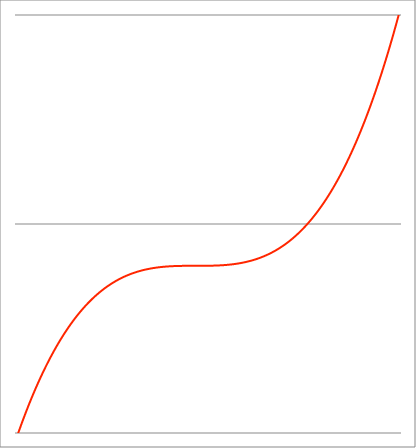
| Category | Series 1 |
|---|---|
| -0.94 | -1.031 |
| -0.93899 | -1.028 |
| -0.93798 | -1.025 |
| -0.93697 | -1.023 |
| -0.93596 | -1.02 |
| -0.93495 | -1.017 |
| -0.93394 | -1.015 |
| -0.93293 | -1.012 |
| -0.93192 | -1.009 |
| -0.93091 | -1.007 |
| -0.9299 | -1.004 |
| -0.92889 | -1.001 |
| -0.92788 | -0.999 |
| -0.92687 | -0.996 |
| -0.925860000000001 | -0.994 |
| -0.924850000000001 | -0.991 |
| -0.923840000000001 | -0.988 |
| -0.922830000000001 | -0.986 |
| -0.921820000000001 | -0.983 |
| -0.920810000000001 | -0.981 |
| -0.919800000000001 | -0.978 |
| -0.918790000000001 | -0.976 |
| -0.917780000000001 | -0.973 |
| -0.916770000000001 | -0.971 |
| -0.915760000000001 | -0.968 |
| -0.914750000000001 | -0.965 |
| -0.913740000000001 | -0.963 |
| -0.912730000000001 | -0.96 |
| -0.911720000000001 | -0.958 |
| -0.910710000000001 | -0.955 |
| -0.909700000000001 | -0.953 |
| -0.908690000000001 | -0.95 |
| -0.907680000000001 | -0.948 |
| -0.906670000000001 | -0.945 |
| -0.905660000000001 | -0.943 |
| -0.904650000000001 | -0.94 |
| -0.903640000000002 | -0.938 |
| -0.902630000000002 | -0.935 |
| -0.901620000000002 | -0.933 |
| -0.900610000000002 | -0.93 |
| -0.899600000000002 | -0.928 |
| -0.898590000000002 | -0.926 |
| -0.897580000000002 | -0.923 |
| -0.896570000000002 | -0.921 |
| -0.895560000000002 | -0.918 |
| -0.894550000000002 | -0.916 |
| -0.893540000000002 | -0.913 |
| -0.892530000000002 | -0.911 |
| -0.891520000000002 | -0.909 |
| -0.890510000000002 | -0.906 |
| -0.889500000000002 | -0.904 |
| -0.888490000000002 | -0.901 |
| -0.887480000000002 | -0.899 |
| -0.886470000000002 | -0.897 |
| -0.885460000000002 | -0.894 |
| -0.884450000000002 | -0.892 |
| -0.883440000000002 | -0.889 |
| -0.882430000000002 | -0.887 |
| -0.881420000000002 | -0.885 |
| -0.880410000000003 | -0.882 |
| -0.879400000000003 | -0.88 |
| -0.878390000000003 | -0.878 |
| -0.877380000000003 | -0.875 |
| -0.876370000000003 | -0.873 |
| -0.875360000000003 | -0.871 |
| -0.874350000000003 | -0.868 |
| -0.873340000000003 | -0.866 |
| -0.872330000000003 | -0.864 |
| -0.871320000000003 | -0.862 |
| -0.870310000000003 | -0.859 |
| -0.869300000000003 | -0.857 |
| -0.868290000000003 | -0.855 |
| -0.867280000000003 | -0.852 |
| -0.866270000000003 | -0.85 |
| -0.865260000000003 | -0.848 |
| -0.864250000000003 | -0.846 |
| -0.863240000000003 | -0.843 |
| -0.862230000000003 | -0.841 |
| -0.861220000000003 | -0.839 |
| -0.860210000000003 | -0.837 |
| -0.859200000000003 | -0.834 |
| -0.858190000000004 | -0.832 |
| -0.857180000000004 | -0.83 |
| -0.856170000000004 | -0.828 |
| -0.855160000000004 | -0.825 |
| -0.854150000000004 | -0.823 |
| -0.853140000000004 | -0.821 |
| -0.852130000000004 | -0.819 |
| -0.851120000000004 | -0.817 |
| -0.850110000000004 | -0.814 |
| -0.849100000000004 | -0.812 |
| -0.848090000000004 | -0.81 |
| -0.847080000000004 | -0.808 |
| -0.846070000000004 | -0.806 |
| -0.845060000000004 | -0.803 |
| -0.844050000000004 | -0.801 |
| -0.843040000000004 | -0.799 |
| -0.842030000000004 | -0.797 |
| -0.841020000000004 | -0.795 |
| -0.840010000000004 | -0.793 |
| -0.839000000000004 | -0.791 |
| -0.837990000000004 | -0.788 |
| -0.836980000000004 | -0.786 |
| -0.835970000000004 | -0.784 |
| -0.834960000000005 | -0.782 |
| -0.833950000000005 | -0.78 |
| -0.832940000000005 | -0.778 |
| -0.831930000000005 | -0.776 |
| -0.830920000000005 | -0.774 |
| -0.829910000000005 | -0.772 |
| -0.828900000000005 | -0.77 |
| -0.827890000000005 | -0.767 |
| -0.826880000000005 | -0.765 |
| -0.825870000000005 | -0.763 |
| -0.824860000000005 | -0.761 |
| -0.823850000000005 | -0.759 |
| -0.822840000000005 | -0.757 |
| -0.821830000000005 | -0.755 |
| -0.820820000000005 | -0.753 |
| -0.819810000000005 | -0.751 |
| -0.818800000000005 | -0.749 |
| -0.817790000000005 | -0.747 |
| -0.816780000000005 | -0.745 |
| -0.815770000000005 | -0.743 |
| -0.814760000000005 | -0.741 |
| -0.813750000000005 | -0.739 |
| -0.812740000000006 | -0.737 |
| -0.811730000000006 | -0.735 |
| -0.810720000000006 | -0.733 |
| -0.809710000000006 | -0.731 |
| -0.808700000000006 | -0.729 |
| -0.807690000000006 | -0.727 |
| -0.806680000000006 | -0.725 |
| -0.805670000000006 | -0.723 |
| -0.804660000000006 | -0.721 |
| -0.803650000000006 | -0.719 |
| -0.802640000000006 | -0.717 |
| -0.801630000000006 | -0.715 |
| -0.800620000000006 | -0.713 |
| -0.799610000000006 | -0.711 |
| -0.798600000000006 | -0.709 |
| -0.797590000000006 | -0.707 |
| -0.796580000000006 | -0.705 |
| -0.795570000000006 | -0.704 |
| -0.794560000000006 | -0.702 |
| -0.793550000000006 | -0.7 |
| -0.792540000000006 | -0.698 |
| -0.791530000000006 | -0.696 |
| -0.790520000000006 | -0.694 |
| -0.789510000000007 | -0.692 |
| -0.788500000000007 | -0.69 |
| -0.787490000000007 | -0.688 |
| -0.786480000000007 | -0.686 |
| -0.785470000000007 | -0.685 |
| -0.784460000000007 | -0.683 |
| -0.783450000000007 | -0.681 |
| -0.782440000000007 | -0.679 |
| -0.781430000000007 | -0.677 |
| -0.780420000000007 | -0.675 |
| -0.779410000000007 | -0.673 |
| -0.778400000000007 | -0.672 |
| -0.777390000000007 | -0.67 |
| -0.776380000000007 | -0.668 |
| -0.775370000000007 | -0.666 |
| -0.774360000000007 | -0.664 |
| -0.773350000000007 | -0.663 |
| -0.772340000000007 | -0.661 |
| -0.771330000000007 | -0.659 |
| -0.770320000000007 | -0.657 |
| -0.769310000000007 | -0.655 |
| -0.768300000000007 | -0.654 |
| -0.767290000000007 | -0.652 |
| -0.766280000000008 | -0.65 |
| -0.765270000000008 | -0.648 |
| -0.764260000000008 | -0.646 |
| -0.763250000000008 | -0.645 |
| -0.762240000000008 | -0.643 |
| -0.761230000000008 | -0.641 |
| -0.760220000000008 | -0.639 |
| -0.759210000000008 | -0.638 |
| -0.758200000000008 | -0.636 |
| -0.757190000000008 | -0.634 |
| -0.756180000000008 | -0.632 |
| -0.755170000000008 | -0.631 |
| -0.754160000000008 | -0.629 |
| -0.753150000000008 | -0.627 |
| -0.752140000000008 | -0.625 |
| -0.751130000000008 | -0.624 |
| -0.750120000000008 | -0.622 |
| -0.749110000000008 | -0.62 |
| -0.748100000000008 | -0.619 |
| -0.747090000000008 | -0.617 |
| -0.746080000000008 | -0.615 |
| -0.745070000000008 | -0.614 |
| -0.744060000000009 | -0.612 |
| -0.743050000000009 | -0.61 |
| -0.742040000000009 | -0.609 |
| -0.741030000000009 | -0.607 |
| -0.740020000000009 | -0.605 |
| -0.739010000000009 | -0.604 |
| -0.738000000000009 | -0.602 |
| -0.736990000000009 | -0.6 |
| -0.735980000000009 | -0.599 |
| -0.734970000000009 | -0.597 |
| -0.733960000000009 | -0.595 |
| -0.732950000000009 | -0.594 |
| -0.731940000000009 | -0.592 |
| -0.730930000000009 | -0.591 |
| -0.729920000000009 | -0.589 |
| -0.728910000000009 | -0.587 |
| -0.727900000000009 | -0.586 |
| -0.726890000000009 | -0.584 |
| -0.725880000000009 | -0.582 |
| -0.724870000000009 | -0.581 |
| -0.723860000000009 | -0.579 |
| -0.722850000000009 | -0.578 |
| -0.72184000000001 | -0.576 |
| -0.72083000000001 | -0.575 |
| -0.71982000000001 | -0.573 |
| -0.71881000000001 | -0.571 |
| -0.71780000000001 | -0.57 |
| -0.71679000000001 | -0.568 |
| -0.71578000000001 | -0.567 |
| -0.71477000000001 | -0.565 |
| -0.71376000000001 | -0.564 |
| -0.71275000000001 | -0.562 |
| -0.71174000000001 | -0.561 |
| -0.71073000000001 | -0.559 |
| -0.70972000000001 | -0.557 |
| -0.70871000000001 | -0.556 |
| -0.70770000000001 | -0.554 |
| -0.70669000000001 | -0.553 |
| -0.70568000000001 | -0.551 |
| -0.70467000000001 | -0.55 |
| -0.70366000000001 | -0.548 |
| -0.70265000000001 | -0.547 |
| -0.70164000000001 | -0.545 |
| -0.70063000000001 | -0.544 |
| -0.69962000000001 | -0.542 |
| -0.69861000000001 | -0.541 |
| -0.697600000000011 | -0.539 |
| -0.696590000000011 | -0.538 |
| -0.695580000000011 | -0.537 |
| -0.694570000000011 | -0.535 |
| -0.693560000000011 | -0.534 |
| -0.692550000000011 | -0.532 |
| -0.691540000000011 | -0.531 |
| -0.690530000000011 | -0.529 |
| -0.689520000000011 | -0.528 |
| -0.688510000000011 | -0.526 |
| -0.687500000000011 | -0.525 |
| -0.686490000000011 | -0.524 |
| -0.685480000000011 | -0.522 |
| -0.684470000000011 | -0.521 |
| -0.683460000000011 | -0.519 |
| -0.682450000000011 | -0.518 |
| -0.681440000000011 | -0.516 |
| -0.680430000000011 | -0.515 |
| -0.679420000000011 | -0.514 |
| -0.678410000000011 | -0.512 |
| -0.677400000000011 | -0.511 |
| -0.676390000000011 | -0.509 |
| -0.675380000000012 | -0.508 |
| -0.674370000000012 | -0.507 |
| -0.673360000000012 | -0.505 |
| -0.672350000000012 | -0.504 |
| -0.671340000000012 | -0.503 |
| -0.670330000000012 | -0.501 |
| -0.669320000000012 | -0.5 |
| -0.668310000000012 | -0.498 |
| -0.667300000000012 | -0.497 |
| -0.666290000000012 | -0.496 |
| -0.665280000000012 | -0.494 |
| -0.664270000000012 | -0.493 |
| -0.663260000000012 | -0.492 |
| -0.662250000000012 | -0.49 |
| -0.661240000000012 | -0.489 |
| -0.660230000000012 | -0.488 |
| -0.659220000000012 | -0.486 |
| -0.658210000000012 | -0.485 |
| -0.657200000000012 | -0.484 |
| -0.656190000000012 | -0.483 |
| -0.655180000000012 | -0.481 |
| -0.654170000000012 | -0.48 |
| -0.653160000000013 | -0.479 |
| -0.652150000000013 | -0.477 |
| -0.651140000000013 | -0.476 |
| -0.650130000000013 | -0.475 |
| -0.649120000000013 | -0.474 |
| -0.648110000000013 | -0.472 |
| -0.647100000000013 | -0.471 |
| -0.646090000000013 | -0.47 |
| -0.645080000000013 | -0.468 |
| -0.644070000000013 | -0.467 |
| -0.643060000000013 | -0.466 |
| -0.642050000000013 | -0.465 |
| -0.641040000000013 | -0.463 |
| -0.640030000000013 | -0.462 |
| -0.639020000000013 | -0.461 |
| -0.638010000000013 | -0.46 |
| -0.637000000000013 | -0.458 |
| -0.635990000000013 | -0.457 |
| -0.634980000000013 | -0.456 |
| -0.633970000000013 | -0.455 |
| -0.632960000000013 | -0.454 |
| -0.631950000000013 | -0.452 |
| -0.630940000000014 | -0.451 |
| -0.629930000000014 | -0.45 |
| -0.628920000000014 | -0.449 |
| -0.627910000000014 | -0.448 |
| -0.626900000000014 | -0.446 |
| -0.625890000000014 | -0.445 |
| -0.624880000000014 | -0.444 |
| -0.623870000000014 | -0.443 |
| -0.622860000000014 | -0.442 |
| -0.621850000000014 | -0.44 |
| -0.620840000000014 | -0.439 |
| -0.619830000000014 | -0.438 |
| -0.618820000000014 | -0.437 |
| -0.617810000000014 | -0.436 |
| -0.616800000000014 | -0.435 |
| -0.615790000000014 | -0.434 |
| -0.614780000000014 | -0.432 |
| -0.613770000000014 | -0.431 |
| -0.612760000000014 | -0.43 |
| -0.611750000000014 | -0.429 |
| -0.610740000000014 | -0.428 |
| -0.609730000000014 | -0.427 |
| -0.608720000000014 | -0.426 |
| -0.607710000000015 | -0.424 |
| -0.606700000000015 | -0.423 |
| -0.605690000000015 | -0.422 |
| -0.604680000000015 | -0.421 |
| -0.603670000000015 | -0.42 |
| -0.602660000000015 | -0.419 |
| -0.601650000000015 | -0.418 |
| -0.600640000000015 | -0.417 |
| -0.599630000000015 | -0.416 |
| -0.598620000000015 | -0.415 |
| -0.597610000000015 | -0.413 |
| -0.596600000000015 | -0.412 |
| -0.595590000000015 | -0.411 |
| -0.594580000000015 | -0.41 |
| -0.593570000000015 | -0.409 |
| -0.592560000000015 | -0.408 |
| -0.591550000000015 | -0.407 |
| -0.590540000000015 | -0.406 |
| -0.589530000000015 | -0.405 |
| -0.588520000000015 | -0.404 |
| -0.587510000000016 | -0.403 |
| -0.586500000000016 | -0.402 |
| -0.585490000000016 | -0.401 |
| -0.584480000000016 | -0.4 |
| -0.583470000000016 | -0.399 |
| -0.582460000000016 | -0.398 |
| -0.581450000000016 | -0.397 |
| -0.580440000000016 | -0.396 |
| -0.579430000000016 | -0.395 |
| -0.578420000000016 | -0.394 |
| -0.577410000000016 | -0.393 |
| -0.576400000000016 | -0.392 |
| -0.575390000000016 | -0.39 |
| -0.574380000000016 | -0.389 |
| -0.573370000000016 | -0.388 |
| -0.572360000000016 | -0.388 |
| -0.571350000000016 | -0.387 |
| -0.570340000000016 | -0.386 |
| -0.569330000000016 | -0.385 |
| -0.568320000000016 | -0.384 |
| -0.567310000000016 | -0.383 |
| -0.566300000000016 | -0.382 |
| -0.565290000000016 | -0.381 |
| -0.564280000000017 | -0.38 |
| -0.563270000000017 | -0.379 |
| -0.562260000000017 | -0.378 |
| -0.561250000000017 | -0.377 |
| -0.560240000000017 | -0.376 |
| -0.559230000000017 | -0.375 |
| -0.558220000000017 | -0.374 |
| -0.557210000000017 | -0.373 |
| -0.556200000000017 | -0.372 |
| -0.555190000000017 | -0.371 |
| -0.554180000000017 | -0.37 |
| -0.553170000000017 | -0.369 |
| -0.552160000000017 | -0.368 |
| -0.551150000000017 | -0.367 |
| -0.550140000000017 | -0.367 |
| -0.549130000000017 | -0.366 |
| -0.548120000000017 | -0.365 |
| -0.547110000000017 | -0.364 |
| -0.546100000000017 | -0.363 |
| -0.545090000000017 | -0.362 |
| -0.544080000000017 | -0.361 |
| -0.543070000000017 | -0.36 |
| -0.542060000000018 | -0.359 |
| -0.541050000000018 | -0.358 |
| -0.540040000000018 | -0.357 |
| -0.539030000000018 | -0.357 |
| -0.538020000000018 | -0.356 |
| -0.537010000000018 | -0.355 |
| -0.536000000000018 | -0.354 |
| -0.534990000000018 | -0.353 |
| -0.533980000000018 | -0.352 |
| -0.532970000000018 | -0.351 |
| -0.531960000000018 | -0.351 |
| -0.530950000000018 | -0.35 |
| -0.529940000000018 | -0.349 |
| -0.528930000000018 | -0.348 |
| -0.527920000000018 | -0.347 |
| -0.526910000000018 | -0.346 |
| -0.525900000000018 | -0.345 |
| -0.524890000000018 | -0.345 |
| -0.523880000000018 | -0.344 |
| -0.522870000000018 | -0.343 |
| -0.521860000000018 | -0.342 |
| -0.520850000000018 | -0.341 |
| -0.519840000000019 | -0.34 |
| -0.518830000000019 | -0.34 |
| -0.517820000000019 | -0.339 |
| -0.516810000000019 | -0.338 |
| -0.515800000000019 | -0.337 |
| -0.514790000000019 | -0.336 |
| -0.513780000000019 | -0.336 |
| -0.512770000000019 | -0.335 |
| -0.511760000000019 | -0.334 |
| -0.510750000000019 | -0.333 |
| -0.509740000000019 | -0.332 |
| -0.508730000000019 | -0.332 |
| -0.507720000000019 | -0.331 |
| -0.506710000000019 | -0.33 |
| -0.505700000000019 | -0.329 |
| -0.504690000000019 | -0.329 |
| -0.503680000000019 | -0.328 |
| -0.502670000000019 | -0.327 |
| -0.501660000000019 | -0.326 |
| -0.500650000000019 | -0.325 |
| -0.499640000000019 | -0.325 |
| -0.498630000000019 | -0.324 |
| -0.497620000000019 | -0.323 |
| -0.496610000000019 | -0.322 |
| -0.495600000000019 | -0.322 |
| -0.494590000000019 | -0.321 |
| -0.493580000000019 | -0.32 |
| -0.492570000000019 | -0.32 |
| -0.491560000000019 | -0.319 |
| -0.490550000000019 | -0.318 |
| -0.489540000000019 | -0.317 |
| -0.488530000000019 | -0.317 |
| -0.487520000000019 | -0.316 |
| -0.486510000000019 | -0.315 |
| -0.485500000000019 | -0.314 |
| -0.484490000000019 | -0.314 |
| -0.483480000000019 | -0.313 |
| -0.482470000000019 | -0.312 |
| -0.481460000000019 | -0.312 |
| -0.480450000000019 | -0.311 |
| -0.479440000000019 | -0.31 |
| -0.478430000000019 | -0.31 |
| -0.477420000000019 | -0.309 |
| -0.476410000000019 | -0.308 |
| -0.475400000000019 | -0.307 |
| -0.474390000000019 | -0.307 |
| -0.473380000000019 | -0.306 |
| -0.472370000000019 | -0.305 |
| -0.471360000000019 | -0.305 |
| -0.470350000000019 | -0.304 |
| -0.469340000000019 | -0.303 |
| -0.468330000000019 | -0.303 |
| -0.467320000000019 | -0.302 |
| -0.466310000000019 | -0.301 |
| -0.465300000000019 | -0.301 |
| -0.464290000000019 | -0.3 |
| -0.463280000000019 | -0.299 |
| -0.462270000000019 | -0.299 |
| -0.461260000000019 | -0.298 |
| -0.460250000000019 | -0.297 |
| -0.459240000000019 | -0.297 |
| -0.458230000000019 | -0.296 |
| -0.457220000000019 | -0.296 |
| -0.456210000000019 | -0.295 |
| -0.455200000000019 | -0.294 |
| -0.454190000000019 | -0.294 |
| -0.453180000000019 | -0.293 |
| -0.452170000000019 | -0.292 |
| -0.451160000000019 | -0.292 |
| -0.450150000000019 | -0.291 |
| -0.449140000000019 | -0.291 |
| -0.448130000000019 | -0.29 |
| -0.447120000000019 | -0.289 |
| -0.446110000000019 | -0.289 |
| -0.445100000000019 | -0.288 |
| -0.444090000000019 | -0.288 |
| -0.443080000000019 | -0.287 |
| -0.442070000000019 | -0.286 |
| -0.441060000000019 | -0.286 |
| -0.440050000000019 | -0.285 |
| -0.439040000000019 | -0.285 |
| -0.438030000000019 | -0.284 |
| -0.437020000000019 | -0.283 |
| -0.436010000000019 | -0.283 |
| -0.435000000000019 | -0.282 |
| -0.433990000000019 | -0.282 |
| -0.432980000000019 | -0.281 |
| -0.431970000000019 | -0.281 |
| -0.430960000000019 | -0.28 |
| -0.429950000000019 | -0.279 |
| -0.428940000000019 | -0.279 |
| -0.427930000000019 | -0.278 |
| -0.426920000000019 | -0.278 |
| -0.425910000000019 | -0.277 |
| -0.424900000000019 | -0.277 |
| -0.423890000000019 | -0.276 |
| -0.422880000000018 | -0.276 |
| -0.421870000000018 | -0.275 |
| -0.420860000000018 | -0.275 |
| -0.419850000000018 | -0.274 |
| -0.418840000000018 | -0.273 |
| -0.417830000000018 | -0.273 |
| -0.416820000000018 | -0.272 |
| -0.415810000000018 | -0.272 |
| -0.414800000000018 | -0.271 |
| -0.413790000000018 | -0.271 |
| -0.412780000000018 | -0.27 |
| -0.411770000000018 | -0.27 |
| -0.410760000000018 | -0.269 |
| -0.409750000000018 | -0.269 |
| -0.408740000000018 | -0.268 |
| -0.407730000000018 | -0.268 |
| -0.406720000000018 | -0.267 |
| -0.405710000000018 | -0.267 |
| -0.404700000000018 | -0.266 |
| -0.403690000000018 | -0.266 |
| -0.402680000000018 | -0.265 |
| -0.401670000000018 | -0.265 |
| -0.400660000000018 | -0.264 |
| -0.399650000000018 | -0.264 |
| -0.398640000000018 | -0.263 |
| -0.397630000000018 | -0.263 |
| -0.396620000000018 | -0.262 |
| -0.395610000000018 | -0.262 |
| -0.394600000000018 | -0.261 |
| -0.393590000000018 | -0.261 |
| -0.392580000000018 | -0.261 |
| -0.391570000000018 | -0.26 |
| -0.390560000000018 | -0.26 |
| -0.389550000000018 | -0.259 |
| -0.388540000000018 | -0.259 |
| -0.387530000000018 | -0.258 |
| -0.386520000000018 | -0.258 |
| -0.385510000000018 | -0.257 |
| -0.384500000000018 | -0.257 |
| -0.383490000000018 | -0.256 |
| -0.382480000000018 | -0.256 |
| -0.381470000000018 | -0.256 |
| -0.380460000000018 | -0.255 |
| -0.379450000000018 | -0.255 |
| -0.378440000000018 | -0.254 |
| -0.377430000000018 | -0.254 |
| -0.376420000000018 | -0.253 |
| -0.375410000000018 | -0.253 |
| -0.374400000000018 | -0.252 |
| -0.373390000000018 | -0.252 |
| -0.372380000000018 | -0.252 |
| -0.371370000000018 | -0.251 |
| -0.370360000000018 | -0.251 |
| -0.369350000000018 | -0.25 |
| -0.368340000000018 | -0.25 |
| -0.367330000000018 | -0.25 |
| -0.366320000000018 | -0.249 |
| -0.365310000000018 | -0.249 |
| -0.364300000000018 | -0.248 |
| -0.363290000000018 | -0.248 |
| -0.362280000000018 | -0.248 |
| -0.361270000000018 | -0.247 |
| -0.360260000000018 | -0.247 |
| -0.359250000000018 | -0.246 |
| -0.358240000000018 | -0.246 |
| -0.357230000000018 | -0.246 |
| -0.356220000000018 | -0.245 |
| -0.355210000000018 | -0.245 |
| -0.354200000000018 | -0.244 |
| -0.353190000000018 | -0.244 |
| -0.352180000000018 | -0.244 |
| -0.351170000000018 | -0.243 |
| -0.350160000000018 | -0.243 |
| -0.349150000000018 | -0.243 |
| -0.348140000000018 | -0.242 |
| -0.347130000000018 | -0.242 |
| -0.346120000000018 | -0.241 |
| -0.345110000000018 | -0.241 |
| -0.344100000000018 | -0.241 |
| -0.343090000000018 | -0.24 |
| -0.342080000000018 | -0.24 |
| -0.341070000000018 | -0.24 |
| -0.340060000000018 | -0.239 |
| -0.339050000000018 | -0.239 |
| -0.338040000000018 | -0.239 |
| -0.337030000000018 | -0.238 |
| -0.336020000000018 | -0.238 |
| -0.335010000000018 | -0.238 |
| -0.334000000000018 | -0.237 |
| -0.332990000000017 | -0.237 |
| -0.331980000000017 | -0.237 |
| -0.330970000000017 | -0.236 |
| -0.329960000000017 | -0.236 |
| -0.328950000000017 | -0.236 |
| -0.327940000000017 | -0.235 |
| -0.326930000000017 | -0.235 |
| -0.325920000000017 | -0.235 |
| -0.324910000000017 | -0.234 |
| -0.323900000000017 | -0.234 |
| -0.322890000000017 | -0.234 |
| -0.321880000000017 | -0.233 |
| -0.320870000000017 | -0.233 |
| -0.319860000000017 | -0.233 |
| -0.318850000000017 | -0.232 |
| -0.317840000000017 | -0.232 |
| -0.316830000000017 | -0.232 |
| -0.315820000000017 | -0.232 |
| -0.314810000000017 | -0.231 |
| -0.313800000000017 | -0.231 |
| -0.312790000000017 | -0.231 |
| -0.311780000000017 | -0.23 |
| -0.310770000000017 | -0.23 |
| -0.309760000000017 | -0.23 |
| -0.308750000000017 | -0.229 |
| -0.307740000000017 | -0.229 |
| -0.306730000000017 | -0.229 |
| -0.305720000000017 | -0.229 |
| -0.304710000000017 | -0.228 |
| -0.303700000000017 | -0.228 |
| -0.302690000000017 | -0.228 |
| -0.301680000000017 | -0.227 |
| -0.300670000000017 | -0.227 |
| -0.299660000000017 | -0.227 |
| -0.298650000000017 | -0.227 |
| -0.297640000000017 | -0.226 |
| -0.296630000000017 | -0.226 |
| -0.295620000000017 | -0.226 |
| -0.294610000000017 | -0.226 |
| -0.293600000000017 | -0.225 |
| -0.292590000000017 | -0.225 |
| -0.291580000000017 | -0.225 |
| -0.290570000000017 | -0.225 |
| -0.289560000000017 | -0.224 |
| -0.288550000000017 | -0.224 |
| -0.287540000000017 | -0.224 |
| -0.286530000000017 | -0.224 |
| -0.285520000000017 | -0.223 |
| -0.284510000000017 | -0.223 |
| -0.283500000000017 | -0.223 |
| -0.282490000000017 | -0.223 |
| -0.281480000000017 | -0.222 |
| -0.280470000000017 | -0.222 |
| -0.279460000000017 | -0.222 |
| -0.278450000000017 | -0.222 |
| -0.277440000000017 | -0.221 |
| -0.276430000000017 | -0.221 |
| -0.275420000000017 | -0.221 |
| -0.274410000000017 | -0.221 |
| -0.273400000000017 | -0.22 |
| -0.272390000000017 | -0.22 |
| -0.271380000000017 | -0.22 |
| -0.270370000000017 | -0.22 |
| -0.269360000000017 | -0.22 |
| -0.268350000000017 | -0.219 |
| -0.267340000000017 | -0.219 |
| -0.266330000000017 | -0.219 |
| -0.265320000000017 | -0.219 |
| -0.264310000000017 | -0.218 |
| -0.263300000000017 | -0.218 |
| -0.262290000000017 | -0.218 |
| -0.261280000000017 | -0.218 |
| -0.260270000000017 | -0.218 |
| -0.259260000000017 | -0.217 |
| -0.258250000000017 | -0.217 |
| -0.257240000000017 | -0.217 |
| -0.256230000000017 | -0.217 |
| -0.255220000000017 | -0.217 |
| -0.254210000000017 | -0.216 |
| -0.253200000000017 | -0.216 |
| -0.252190000000017 | -0.216 |
| -0.251180000000017 | -0.216 |
| -0.250170000000017 | -0.216 |
| -0.249160000000017 | -0.215 |
| -0.248150000000017 | -0.215 |
| -0.247140000000017 | -0.215 |
| -0.246130000000017 | -0.215 |
| -0.245120000000017 | -0.215 |
| -0.244110000000017 | -0.215 |
| -0.243100000000017 | -0.214 |
| -0.242090000000017 | -0.214 |
| -0.241080000000017 | -0.214 |
| -0.240070000000017 | -0.214 |
| -0.239060000000017 | -0.214 |
| -0.238050000000017 | -0.213 |
| -0.237040000000016 | -0.213 |
| -0.236030000000016 | -0.213 |
| -0.235020000000016 | -0.213 |
| -0.234010000000016 | -0.213 |
| -0.233000000000016 | -0.213 |
| -0.231990000000016 | -0.212 |
| -0.230980000000016 | -0.212 |
| -0.229970000000016 | -0.212 |
| -0.228960000000016 | -0.212 |
| -0.227950000000016 | -0.212 |
| -0.226940000000016 | -0.212 |
| -0.225930000000016 | -0.212 |
| -0.224920000000016 | -0.211 |
| -0.223910000000016 | -0.211 |
| -0.222900000000016 | -0.211 |
| -0.221890000000016 | -0.211 |
| -0.220880000000016 | -0.211 |
| -0.219870000000016 | -0.211 |
| -0.218860000000016 | -0.21 |
| -0.217850000000016 | -0.21 |
| -0.216840000000016 | -0.21 |
| -0.215830000000016 | -0.21 |
| -0.214820000000016 | -0.21 |
| -0.213810000000016 | -0.21 |
| -0.212800000000016 | -0.21 |
| -0.211790000000016 | -0.209 |
| -0.210780000000016 | -0.209 |
| -0.209770000000016 | -0.209 |
| -0.208760000000016 | -0.209 |
| -0.207750000000016 | -0.209 |
| -0.206740000000016 | -0.209 |
| -0.205730000000016 | -0.209 |
| -0.204720000000016 | -0.209 |
| -0.203710000000016 | -0.208 |
| -0.202700000000016 | -0.208 |
| -0.201690000000016 | -0.208 |
| -0.200680000000016 | -0.208 |
| -0.199670000000016 | -0.208 |
| -0.198660000000016 | -0.208 |
| -0.197650000000016 | -0.208 |
| -0.196640000000016 | -0.208 |
| -0.195630000000016 | -0.207 |
| -0.194620000000016 | -0.207 |
| -0.193610000000016 | -0.207 |
| -0.192600000000016 | -0.207 |
| -0.191590000000016 | -0.207 |
| -0.190580000000016 | -0.207 |
| -0.189570000000016 | -0.207 |
| -0.188560000000016 | -0.207 |
| -0.187550000000016 | -0.207 |
| -0.186540000000016 | -0.206 |
| -0.185530000000016 | -0.206 |
| -0.184520000000016 | -0.206 |
| -0.183510000000016 | -0.206 |
| -0.182500000000016 | -0.206 |
| -0.181490000000016 | -0.206 |
| -0.180480000000016 | -0.206 |
| -0.179470000000016 | -0.206 |
| -0.178460000000016 | -0.206 |
| -0.177450000000016 | -0.206 |
| -0.176440000000016 | -0.205 |
| -0.175430000000016 | -0.205 |
| -0.174420000000016 | -0.205 |
| -0.173410000000016 | -0.205 |
| -0.172400000000016 | -0.205 |
| -0.171390000000016 | -0.205 |
| -0.170380000000016 | -0.205 |
| -0.169370000000016 | -0.205 |
| -0.168360000000016 | -0.205 |
| -0.167350000000016 | -0.205 |
| -0.166340000000016 | -0.205 |
| -0.165330000000016 | -0.205 |
| -0.164320000000016 | -0.204 |
| -0.163310000000016 | -0.204 |
| -0.162300000000016 | -0.204 |
| -0.161290000000016 | -0.204 |
| -0.160280000000016 | -0.204 |
| -0.159270000000016 | -0.204 |
| -0.158260000000016 | -0.204 |
| -0.157250000000016 | -0.204 |
| -0.156240000000016 | -0.204 |
| -0.155230000000016 | -0.204 |
| -0.154220000000016 | -0.204 |
| -0.153210000000016 | -0.204 |
| -0.152200000000016 | -0.204 |
| -0.151190000000016 | -0.203 |
| -0.150180000000016 | -0.203 |
| -0.149170000000016 | -0.203 |
| -0.148160000000016 | -0.203 |
| -0.147150000000016 | -0.203 |
| -0.146140000000016 | -0.203 |
| -0.145130000000016 | -0.203 |
| -0.144120000000015 | -0.203 |
| -0.143110000000015 | -0.203 |
| -0.142100000000015 | -0.203 |
| -0.141090000000015 | -0.203 |
| -0.140080000000015 | -0.203 |
| -0.139070000000015 | -0.203 |
| -0.138060000000015 | -0.203 |
| -0.137050000000015 | -0.203 |
| -0.136040000000015 | -0.203 |
| -0.135030000000015 | -0.202 |
| -0.134020000000015 | -0.202 |
| -0.133010000000015 | -0.202 |
| -0.132000000000015 | -0.202 |
| -0.130990000000015 | -0.202 |
| -0.129980000000015 | -0.202 |
| -0.128970000000015 | -0.202 |
| -0.127960000000015 | -0.202 |
| -0.126950000000015 | -0.202 |
| -0.125940000000015 | -0.202 |
| -0.124930000000015 | -0.202 |
| -0.123920000000015 | -0.202 |
| -0.122910000000015 | -0.202 |
| -0.121900000000015 | -0.202 |
| -0.120890000000015 | -0.202 |
| -0.119880000000015 | -0.202 |
| -0.118870000000015 | -0.202 |
| -0.117860000000015 | -0.202 |
| -0.116850000000015 | -0.202 |
| -0.115840000000015 | -0.202 |
| -0.114830000000015 | -0.202 |
| -0.113820000000015 | -0.201 |
| -0.112810000000015 | -0.201 |
| -0.111800000000015 | -0.201 |
| -0.110790000000015 | -0.201 |
| -0.109780000000015 | -0.201 |
| -0.108770000000015 | -0.201 |
| -0.107760000000015 | -0.201 |
| -0.106750000000015 | -0.201 |
| -0.105740000000015 | -0.201 |
| -0.104730000000015 | -0.201 |
| -0.103720000000015 | -0.201 |
| -0.102710000000015 | -0.201 |
| -0.101700000000015 | -0.201 |
| -0.100690000000015 | -0.201 |
| -0.0996800000000154 | -0.201 |
| -0.0986700000000154 | -0.201 |
| -0.0976600000000154 | -0.201 |
| -0.0966500000000154 | -0.201 |
| -0.0956400000000154 | -0.201 |
| -0.0946300000000154 | -0.201 |
| -0.0936200000000154 | -0.201 |
| -0.0926100000000154 | -0.201 |
| -0.0916000000000154 | -0.201 |
| -0.0905900000000154 | -0.201 |
| -0.0895800000000154 | -0.201 |
| -0.0885700000000154 | -0.201 |
| -0.0875600000000154 | -0.201 |
| -0.0865500000000154 | -0.201 |
| -0.0855400000000154 | -0.201 |
| -0.0845300000000154 | -0.201 |
| -0.0835200000000154 | -0.201 |
| -0.0825100000000154 | -0.201 |
| -0.0815000000000154 | -0.201 |
| -0.0804900000000154 | -0.201 |
| -0.0794800000000154 | -0.201 |
| -0.0784700000000154 | -0.2 |
| -0.0774600000000155 | -0.2 |
| -0.0764500000000155 | -0.2 |
| -0.0754400000000155 | -0.2 |
| -0.0744300000000155 | -0.2 |
| -0.0734200000000155 | -0.2 |
| -0.0724100000000155 | -0.2 |
| -0.0714000000000155 | -0.2 |
| -0.0703900000000155 | -0.2 |
| -0.0693800000000155 | -0.2 |
| -0.0683700000000155 | -0.2 |
| -0.0673600000000155 | -0.2 |
| -0.0663500000000155 | -0.2 |
| -0.0653400000000155 | -0.2 |
| -0.0643300000000155 | -0.2 |
| -0.0633200000000155 | -0.2 |
| -0.0623100000000155 | -0.2 |
| -0.0613000000000155 | -0.2 |
| -0.0602900000000155 | -0.2 |
| -0.0592800000000155 | -0.2 |
| -0.0582700000000155 | -0.2 |
| -0.0572600000000155 | -0.2 |
| -0.0562500000000155 | -0.2 |
| -0.0552400000000155 | -0.2 |
| -0.0542300000000155 | -0.2 |
| -0.0532200000000155 | -0.2 |
| -0.0522100000000155 | -0.2 |
| -0.0512000000000155 | -0.2 |
| -0.0501900000000155 | -0.2 |
| -0.0491800000000155 | -0.2 |
| -0.0481700000000155 | -0.2 |
| -0.0471600000000155 | -0.2 |
| -0.0461500000000155 | -0.2 |
| -0.0451400000000155 | -0.2 |
| -0.0441300000000156 | -0.2 |
| -0.0431200000000156 | -0.2 |
| -0.0421100000000156 | -0.2 |
| -0.0411000000000156 | -0.2 |
| -0.0400900000000156 | -0.2 |
| -0.0390800000000156 | -0.2 |
| -0.0380700000000156 | -0.2 |
| -0.0370600000000156 | -0.2 |
| -0.0360500000000156 | -0.2 |
| -0.0350400000000156 | -0.2 |
| -0.0340300000000156 | -0.2 |
| -0.0330200000000156 | -0.2 |
| -0.0320100000000156 | -0.2 |
| -0.0310000000000156 | -0.2 |
| -0.0299900000000156 | -0.2 |
| -0.0289800000000156 | -0.2 |
| -0.0279700000000156 | -0.2 |
| -0.0269600000000156 | -0.2 |
| -0.0259500000000156 | -0.2 |
| -0.0249400000000156 | -0.2 |
| -0.0239300000000156 | -0.2 |
| -0.0229200000000156 | -0.2 |
| -0.0219100000000156 | -0.2 |
| -0.0209000000000156 | -0.2 |
| -0.0198900000000156 | -0.2 |
| -0.0188800000000156 | -0.2 |
| -0.0178700000000156 | -0.2 |
| -0.0168600000000156 | -0.2 |
| -0.0158500000000156 | -0.2 |
| -0.0148400000000156 | -0.2 |
| -0.0138300000000156 | -0.2 |
| -0.0128200000000156 | -0.2 |
| -0.0118100000000156 | -0.2 |
| -0.0108000000000156 | -0.2 |
| -0.00979000000001558 | -0.2 |
| -0.00878000000001558 | -0.2 |
| -0.00777000000001558 | -0.2 |
| -0.00676000000001558 | -0.2 |
| -0.00575000000001558 | -0.2 |
| -0.00474000000001558 | -0.2 |
| -0.00373000000001558 | -0.2 |
| -0.00272000000001558 | -0.2 |
| -0.00171000000001558 | -0.2 |
| -0.000700000000015582 | -0.2 |
| 0.000309999999984418 | -0.2 |
| 0.00131999999998442 | -0.2 |
| 0.00232999999998442 | -0.2 |
| 0.00333999999998442 | -0.2 |
| 0.00434999999998442 | -0.2 |
| 0.00535999999998442 | -0.2 |
| 0.00636999999998442 | -0.2 |
| 0.00737999999998442 | -0.2 |
| 0.00838999999998442 | -0.2 |
| 0.00939999999998442 | -0.2 |
| 0.0104099999999844 | -0.2 |
| 0.0114199999999844 | -0.2 |
| 0.0124299999999844 | -0.2 |
| 0.0134399999999844 | -0.2 |
| 0.0144499999999844 | -0.2 |
| 0.0154599999999844 | -0.2 |
| 0.0164699999999844 | -0.2 |
| 0.0174799999999844 | -0.2 |
| 0.0184899999999844 | -0.2 |
| 0.0194999999999844 | -0.2 |
| 0.0205099999999844 | -0.2 |
| 0.0215199999999844 | -0.2 |
| 0.0225299999999844 | -0.2 |
| 0.0235399999999844 | -0.2 |
| 0.0245499999999844 | -0.2 |
| 0.0255599999999844 | -0.2 |
| 0.0265699999999844 | -0.2 |
| 0.0275799999999844 | -0.2 |
| 0.0285899999999844 | -0.2 |
| 0.0295999999999844 | -0.2 |
| 0.0306099999999844 | -0.2 |
| 0.0316199999999844 | -0.2 |
| 0.0326299999999844 | -0.2 |
| 0.0336399999999844 | -0.2 |
| 0.0346499999999844 | -0.2 |
| 0.0356599999999844 | -0.2 |
| 0.0366699999999844 | -0.2 |
| 0.0376799999999844 | -0.2 |
| 0.0386899999999844 | -0.2 |
| 0.0396999999999844 | -0.2 |
| 0.0407099999999844 | -0.2 |
| 0.0417199999999844 | -0.2 |
| 0.0427299999999844 | -0.2 |
| 0.0437399999999844 | -0.2 |
| 0.0447499999999844 | -0.2 |
| 0.0457599999999844 | -0.2 |
| 0.0467699999999844 | -0.2 |
| 0.0477799999999844 | -0.2 |
| 0.0487899999999844 | -0.2 |
| 0.0497999999999844 | -0.2 |
| 0.0508099999999844 | -0.2 |
| 0.0518199999999844 | -0.2 |
| 0.0528299999999844 | -0.2 |
| 0.0538399999999844 | -0.2 |
| 0.0548499999999844 | -0.2 |
| 0.0558599999999843 | -0.2 |
| 0.0568699999999843 | -0.2 |
| 0.0578799999999843 | -0.2 |
| 0.0588899999999843 | -0.2 |
| 0.0598999999999843 | -0.2 |
| 0.0609099999999843 | -0.2 |
| 0.0619199999999843 | -0.2 |
| 0.0629299999999843 | -0.2 |
| 0.0639399999999843 | -0.2 |
| 0.0649499999999843 | -0.2 |
| 0.0659599999999843 | -0.2 |
| 0.0669699999999843 | -0.2 |
| 0.0679799999999843 | -0.2 |
| 0.0689899999999843 | -0.2 |
| 0.0699999999999843 | -0.2 |
| 0.0710099999999843 | -0.2 |
| 0.0720199999999843 | -0.2 |
| 0.0730299999999843 | -0.2 |
| 0.0740399999999843 | -0.2 |
| 0.0750499999999843 | -0.2 |
| 0.0760599999999843 | -0.2 |
| 0.0770699999999843 | -0.2 |
| 0.0780799999999843 | -0.2 |
| 0.0790899999999843 | -0.2 |
| 0.0800999999999843 | -0.199 |
| 0.0811099999999843 | -0.199 |
| 0.0821199999999843 | -0.199 |
| 0.0831299999999843 | -0.199 |
| 0.0841399999999843 | -0.199 |
| 0.0851499999999843 | -0.199 |
| 0.0861599999999843 | -0.199 |
| 0.0871699999999843 | -0.199 |
| 0.0881799999999843 | -0.199 |
| 0.0891899999999842 | -0.199 |
| 0.0901999999999842 | -0.199 |
| 0.0912099999999842 | -0.199 |
| 0.0922199999999842 | -0.199 |
| 0.0932299999999842 | -0.199 |
| 0.0942399999999842 | -0.199 |
| 0.0952499999999842 | -0.199 |
| 0.0962599999999842 | -0.199 |
| 0.0972699999999842 | -0.199 |
| 0.0982799999999842 | -0.199 |
| 0.0992899999999842 | -0.199 |
| 0.100299999999984 | -0.199 |
| 0.101309999999984 | -0.199 |
| 0.102319999999984 | -0.199 |
| 0.103329999999984 | -0.199 |
| 0.104339999999984 | -0.199 |
| 0.105349999999984 | -0.199 |
| 0.106359999999984 | -0.199 |
| 0.107369999999984 | -0.199 |
| 0.108379999999984 | -0.199 |
| 0.109389999999984 | -0.199 |
| 0.110399999999984 | -0.199 |
| 0.111409999999984 | -0.199 |
| 0.112419999999984 | -0.199 |
| 0.113429999999984 | -0.199 |
| 0.114439999999984 | -0.199 |
| 0.115449999999984 | -0.198 |
| 0.116459999999984 | -0.198 |
| 0.117469999999984 | -0.198 |
| 0.118479999999984 | -0.198 |
| 0.119489999999984 | -0.198 |
| 0.120499999999984 | -0.198 |
| 0.121509999999984 | -0.198 |
| 0.122519999999984 | -0.198 |
| 0.123529999999984 | -0.198 |
| 0.124539999999984 | -0.198 |
| 0.125549999999984 | -0.198 |
| 0.126559999999984 | -0.198 |
| 0.127569999999984 | -0.198 |
| 0.128579999999984 | -0.198 |
| 0.129589999999984 | -0.198 |
| 0.130599999999984 | -0.198 |
| 0.131609999999984 | -0.198 |
| 0.132619999999984 | -0.198 |
| 0.133629999999984 | -0.198 |
| 0.134639999999984 | -0.198 |
| 0.135649999999984 | -0.198 |
| 0.136659999999984 | -0.197 |
| 0.137669999999984 | -0.197 |
| 0.138679999999984 | -0.197 |
| 0.139689999999984 | -0.197 |
| 0.140699999999984 | -0.197 |
| 0.141709999999984 | -0.197 |
| 0.142719999999984 | -0.197 |
| 0.143729999999984 | -0.197 |
| 0.144739999999984 | -0.197 |
| 0.145749999999984 | -0.197 |
| 0.146759999999984 | -0.197 |
| 0.147769999999984 | -0.197 |
| 0.148779999999984 | -0.197 |
| 0.149789999999984 | -0.197 |
| 0.150799999999984 | -0.197 |
| 0.151809999999984 | -0.197 |
| 0.152819999999984 | -0.196 |
| 0.153829999999984 | -0.196 |
| 0.154839999999984 | -0.196 |
| 0.155849999999984 | -0.196 |
| 0.156859999999984 | -0.196 |
| 0.157869999999985 | -0.196 |
| 0.158879999999985 | -0.196 |
| 0.159889999999985 | -0.196 |
| 0.160899999999985 | -0.196 |
| 0.161909999999985 | -0.196 |
| 0.162919999999985 | -0.196 |
| 0.163929999999985 | -0.196 |
| 0.164939999999985 | -0.196 |
| 0.165949999999985 | -0.195 |
| 0.166959999999985 | -0.195 |
| 0.167969999999985 | -0.195 |
| 0.168979999999985 | -0.195 |
| 0.169989999999985 | -0.195 |
| 0.170999999999985 | -0.195 |
| 0.172009999999985 | -0.195 |
| 0.173019999999985 | -0.195 |
| 0.174029999999985 | -0.195 |
| 0.175039999999985 | -0.195 |
| 0.176049999999985 | -0.195 |
| 0.177059999999985 | -0.194 |
| 0.178069999999985 | -0.194 |
| 0.179079999999985 | -0.194 |
| 0.180089999999985 | -0.194 |
| 0.181099999999985 | -0.194 |
| 0.182109999999985 | -0.194 |
| 0.183119999999985 | -0.194 |
| 0.184129999999985 | -0.194 |
| 0.185139999999985 | -0.194 |
| 0.186149999999985 | -0.194 |
| 0.187159999999985 | -0.193 |
| 0.188169999999985 | -0.193 |
| 0.189179999999985 | -0.193 |
| 0.190189999999985 | -0.193 |
| 0.191199999999985 | -0.193 |
| 0.192209999999985 | -0.193 |
| 0.193219999999985 | -0.193 |
| 0.194229999999985 | -0.193 |
| 0.195239999999985 | -0.193 |
| 0.196249999999985 | -0.192 |
| 0.197259999999985 | -0.192 |
| 0.198269999999985 | -0.192 |
| 0.199279999999985 | -0.192 |
| 0.200289999999985 | -0.192 |
| 0.201299999999985 | -0.192 |
| 0.202309999999985 | -0.192 |
| 0.203319999999985 | -0.192 |
| 0.204329999999985 | -0.191 |
| 0.205339999999985 | -0.191 |
| 0.206349999999985 | -0.191 |
| 0.207359999999985 | -0.191 |
| 0.208369999999985 | -0.191 |
| 0.209379999999985 | -0.191 |
| 0.210389999999985 | -0.191 |
| 0.211399999999985 | -0.191 |
| 0.212409999999985 | -0.19 |
| 0.213419999999985 | -0.19 |
| 0.214429999999985 | -0.19 |
| 0.215439999999985 | -0.19 |
| 0.216449999999985 | -0.19 |
| 0.217459999999985 | -0.19 |
| 0.218469999999985 | -0.19 |
| 0.219479999999985 | -0.189 |
| 0.220489999999985 | -0.189 |
| 0.221499999999985 | -0.189 |
| 0.222509999999985 | -0.189 |
| 0.223519999999985 | -0.189 |
| 0.224529999999985 | -0.189 |
| 0.225539999999985 | -0.189 |
| 0.226549999999985 | -0.188 |
| 0.227559999999985 | -0.188 |
| 0.228569999999985 | -0.188 |
| 0.229579999999985 | -0.188 |
| 0.230589999999985 | -0.188 |
| 0.231599999999985 | -0.188 |
| 0.232609999999985 | -0.187 |
| 0.233619999999985 | -0.187 |
| 0.234629999999985 | -0.187 |
| 0.235639999999985 | -0.187 |
| 0.236649999999985 | -0.187 |
| 0.237659999999985 | -0.187 |
| 0.238669999999985 | -0.186 |
| 0.239679999999985 | -0.186 |
| 0.240689999999985 | -0.186 |
| 0.241699999999985 | -0.186 |
| 0.242709999999985 | -0.186 |
| 0.243719999999985 | -0.186 |
| 0.244729999999985 | -0.185 |
| 0.245739999999985 | -0.185 |
| 0.246749999999985 | -0.185 |
| 0.247759999999985 | -0.185 |
| 0.248769999999985 | -0.185 |
| 0.249779999999985 | -0.184 |
| 0.250789999999986 | -0.184 |
| 0.251799999999986 | -0.184 |
| 0.252809999999986 | -0.184 |
| 0.253819999999986 | -0.184 |
| 0.254829999999986 | -0.183 |
| 0.255839999999986 | -0.183 |
| 0.256849999999986 | -0.183 |
| 0.257859999999986 | -0.183 |
| 0.258869999999986 | -0.183 |
| 0.259879999999986 | -0.182 |
| 0.260889999999986 | -0.182 |
| 0.261899999999986 | -0.182 |
| 0.262909999999986 | -0.182 |
| 0.263919999999986 | -0.182 |
| 0.264929999999986 | -0.181 |
| 0.265939999999986 | -0.181 |
| 0.266949999999986 | -0.181 |
| 0.267959999999986 | -0.181 |
| 0.268969999999986 | -0.181 |
| 0.269979999999986 | -0.18 |
| 0.270989999999986 | -0.18 |
| 0.271999999999986 | -0.18 |
| 0.273009999999986 | -0.18 |
| 0.274019999999986 | -0.179 |
| 0.275029999999986 | -0.179 |
| 0.276039999999986 | -0.179 |
| 0.277049999999986 | -0.179 |
| 0.278059999999986 | -0.179 |
| 0.279069999999986 | -0.178 |
| 0.280079999999986 | -0.178 |
| 0.281089999999986 | -0.178 |
| 0.282099999999986 | -0.178 |
| 0.283109999999986 | -0.177 |
| 0.284119999999986 | -0.177 |
| 0.285129999999986 | -0.177 |
| 0.286139999999986 | -0.177 |
| 0.287149999999986 | -0.176 |
| 0.288159999999986 | -0.176 |
| 0.289169999999986 | -0.176 |
| 0.290179999999986 | -0.176 |
| 0.291189999999986 | -0.175 |
| 0.292199999999986 | -0.175 |
| 0.293209999999986 | -0.175 |
| 0.294219999999986 | -0.175 |
| 0.295229999999986 | -0.174 |
| 0.296239999999986 | -0.174 |
| 0.297249999999986 | -0.174 |
| 0.298259999999986 | -0.173 |
| 0.299269999999986 | -0.173 |
| 0.300279999999986 | -0.173 |
| 0.301289999999986 | -0.173 |
| 0.302299999999986 | -0.172 |
| 0.303309999999986 | -0.172 |
| 0.304319999999986 | -0.172 |
| 0.305329999999986 | -0.172 |
| 0.306339999999986 | -0.171 |
| 0.307349999999986 | -0.171 |
| 0.308359999999986 | -0.171 |
| 0.309369999999986 | -0.17 |
| 0.310379999999986 | -0.17 |
| 0.311389999999986 | -0.17 |
| 0.312399999999986 | -0.17 |
| 0.313409999999986 | -0.169 |
| 0.314419999999986 | -0.169 |
| 0.315429999999986 | -0.169 |
| 0.316439999999986 | -0.168 |
| 0.317449999999986 | -0.168 |
| 0.318459999999986 | -0.168 |
| 0.319469999999986 | -0.167 |
| 0.320479999999986 | -0.167 |
| 0.321489999999986 | -0.167 |
| 0.322499999999986 | -0.166 |
| 0.323509999999986 | -0.166 |
| 0.324519999999986 | -0.166 |
| 0.325529999999986 | -0.166 |
| 0.326539999999986 | -0.165 |
| 0.327549999999986 | -0.165 |
| 0.328559999999986 | -0.165 |
| 0.329569999999986 | -0.164 |
| 0.330579999999986 | -0.164 |
| 0.331589999999986 | -0.164 |
| 0.332599999999986 | -0.163 |
| 0.333609999999986 | -0.163 |
| 0.334619999999986 | -0.163 |
| 0.335629999999986 | -0.162 |
| 0.336639999999986 | -0.162 |
| 0.337649999999986 | -0.162 |
| 0.338659999999986 | -0.161 |
| 0.339669999999986 | -0.161 |
| 0.340679999999986 | -0.16 |
| 0.341689999999986 | -0.16 |
| 0.342699999999986 | -0.16 |
| 0.343709999999986 | -0.159 |
| 0.344719999999986 | -0.159 |
| 0.345729999999986 | -0.159 |
| 0.346739999999987 | -0.158 |
| 0.347749999999987 | -0.158 |
| 0.348759999999987 | -0.158 |
| 0.349769999999987 | -0.157 |
| 0.350779999999987 | -0.157 |
| 0.351789999999987 | -0.156 |
| 0.352799999999987 | -0.156 |
| 0.353809999999987 | -0.156 |
| 0.354819999999987 | -0.155 |
| 0.355829999999987 | -0.155 |
| 0.356839999999987 | -0.155 |
| 0.357849999999987 | -0.154 |
| 0.358859999999987 | -0.154 |
| 0.359869999999987 | -0.153 |
| 0.360879999999987 | -0.153 |
| 0.361889999999987 | -0.153 |
| 0.362899999999987 | -0.152 |
| 0.363909999999987 | -0.152 |
| 0.364919999999987 | -0.151 |
| 0.365929999999987 | -0.151 |
| 0.366939999999987 | -0.151 |
| 0.367949999999987 | -0.15 |
| 0.368959999999987 | -0.15 |
| 0.369969999999987 | -0.149 |
| 0.370979999999987 | -0.149 |
| 0.371989999999987 | -0.149 |
| 0.372999999999987 | -0.148 |
| 0.374009999999987 | -0.148 |
| 0.375019999999987 | -0.147 |
| 0.376029999999987 | -0.147 |
| 0.377039999999987 | -0.146 |
| 0.378049999999987 | -0.146 |
| 0.379059999999987 | -0.146 |
| 0.380069999999987 | -0.145 |
| 0.381079999999987 | -0.145 |
| 0.382089999999987 | -0.144 |
| 0.383099999999987 | -0.144 |
| 0.384109999999987 | -0.143 |
| 0.385119999999987 | -0.143 |
| 0.386129999999987 | -0.142 |
| 0.387139999999987 | -0.142 |
| 0.388149999999987 | -0.142 |
| 0.389159999999987 | -0.141 |
| 0.390169999999987 | -0.141 |
| 0.391179999999987 | -0.14 |
| 0.392189999999987 | -0.14 |
| 0.393199999999987 | -0.139 |
| 0.394209999999987 | -0.139 |
| 0.395219999999987 | -0.138 |
| 0.396229999999987 | -0.138 |
| 0.397239999999987 | -0.137 |
| 0.398249999999987 | -0.137 |
| 0.399259999999987 | -0.136 |
| 0.400269999999987 | -0.136 |
| 0.401279999999987 | -0.135 |
| 0.402289999999987 | -0.135 |
| 0.403299999999987 | -0.134 |
| 0.404309999999987 | -0.134 |
| 0.405319999999987 | -0.133 |
| 0.406329999999987 | -0.133 |
| 0.407339999999987 | -0.132 |
| 0.408349999999987 | -0.132 |
| 0.409359999999987 | -0.131 |
| 0.410369999999987 | -0.131 |
| 0.411379999999987 | -0.13 |
| 0.412389999999987 | -0.13 |
| 0.413399999999987 | -0.129 |
| 0.414409999999987 | -0.129 |
| 0.415419999999987 | -0.128 |
| 0.416429999999987 | -0.128 |
| 0.417439999999987 | -0.127 |
| 0.418449999999987 | -0.127 |
| 0.419459999999987 | -0.126 |
| 0.420469999999987 | -0.126 |
| 0.421479999999987 | -0.125 |
| 0.422489999999987 | -0.125 |
| 0.423499999999987 | -0.124 |
| 0.424509999999987 | -0.123 |
| 0.425519999999987 | -0.123 |
| 0.426529999999987 | -0.122 |
| 0.427539999999987 | -0.122 |
| 0.428549999999987 | -0.121 |
| 0.429559999999987 | -0.121 |
| 0.430569999999987 | -0.12 |
| 0.431579999999987 | -0.12 |
| 0.432589999999987 | -0.119 |
| 0.433599999999987 | -0.118 |
| 0.434609999999987 | -0.118 |
| 0.435619999999987 | -0.117 |
| 0.436629999999987 | -0.117 |
| 0.437639999999988 | -0.116 |
| 0.438649999999988 | -0.116 |
| 0.439659999999988 | -0.115 |
| 0.440669999999988 | -0.114 |
| 0.441679999999988 | -0.114 |
| 0.442689999999988 | -0.113 |
| 0.443699999999988 | -0.113 |
| 0.444709999999988 | -0.112 |
| 0.445719999999988 | -0.111 |
| 0.446729999999988 | -0.111 |
| 0.447739999999988 | -0.11 |
| 0.448749999999988 | -0.11 |
| 0.449759999999988 | -0.109 |
| 0.450769999999988 | -0.108 |
| 0.451779999999988 | -0.108 |
| 0.452789999999988 | -0.107 |
| 0.453799999999988 | -0.107 |
| 0.454809999999988 | -0.106 |
| 0.455819999999988 | -0.105 |
| 0.456829999999988 | -0.105 |
| 0.457839999999988 | -0.104 |
| 0.458849999999988 | -0.103 |
| 0.459859999999988 | -0.103 |
| 0.460869999999988 | -0.102 |
| 0.461879999999988 | -0.101 |
| 0.462889999999988 | -0.101 |
| 0.463899999999988 | -0.1 |
| 0.464909999999988 | -0.1 |
| 0.465919999999988 | -0.099 |
| 0.466929999999988 | -0.098 |
| 0.467939999999988 | -0.098 |
| 0.468949999999988 | -0.097 |
| 0.469959999999988 | -0.096 |
| 0.470969999999988 | -0.096 |
| 0.471979999999988 | -0.095 |
| 0.472989999999988 | -0.094 |
| 0.473999999999988 | -0.094 |
| 0.475009999999988 | -0.093 |
| 0.476019999999988 | -0.092 |
| 0.477029999999988 | -0.091 |
| 0.478039999999988 | -0.091 |
| 0.479049999999988 | -0.09 |
| 0.480059999999988 | -0.089 |
| 0.481069999999988 | -0.089 |
| 0.482079999999988 | -0.088 |
| 0.483089999999988 | -0.087 |
| 0.484099999999988 | -0.087 |
| 0.485109999999988 | -0.086 |
| 0.486119999999988 | -0.085 |
| 0.487129999999988 | -0.084 |
| 0.488139999999988 | -0.084 |
| 0.489149999999988 | -0.083 |
| 0.490159999999988 | -0.082 |
| 0.491169999999988 | -0.082 |
| 0.492179999999988 | -0.081 |
| 0.493189999999988 | -0.08 |
| 0.494199999999988 | -0.079 |
| 0.495209999999988 | -0.079 |
| 0.496219999999988 | -0.078 |
| 0.497229999999988 | -0.077 |
| 0.498239999999988 | -0.076 |
| 0.499249999999988 | -0.076 |
| 0.500259999999988 | -0.075 |
| 0.501269999999988 | -0.074 |
| 0.502279999999988 | -0.073 |
| 0.503289999999988 | -0.073 |
| 0.504299999999988 | -0.072 |
| 0.505309999999988 | -0.071 |
| 0.506319999999988 | -0.07 |
| 0.507329999999988 | -0.069 |
| 0.508339999999988 | -0.069 |
| 0.509349999999988 | -0.068 |
| 0.510359999999988 | -0.067 |
| 0.511369999999988 | -0.066 |
| 0.512379999999988 | -0.065 |
| 0.513389999999988 | -0.065 |
| 0.514399999999988 | -0.064 |
| 0.515409999999987 | -0.063 |
| 0.516419999999987 | -0.062 |
| 0.517429999999987 | -0.061 |
| 0.518439999999987 | -0.061 |
| 0.519449999999987 | -0.06 |
| 0.520459999999987 | -0.059 |
| 0.521469999999987 | -0.058 |
| 0.522479999999987 | -0.057 |
| 0.523489999999987 | -0.057 |
| 0.524499999999987 | -0.056 |
| 0.525509999999987 | -0.055 |
| 0.526519999999987 | -0.054 |
| 0.527529999999987 | -0.053 |
| 0.528539999999987 | -0.052 |
| 0.529549999999987 | -0.052 |
| 0.530559999999987 | -0.051 |
| 0.531569999999987 | -0.05 |
| 0.532579999999987 | -0.049 |
| 0.533589999999987 | -0.048 |
| 0.534599999999987 | -0.047 |
| 0.535609999999987 | -0.046 |
| 0.536619999999987 | -0.045 |
| 0.537629999999986 | -0.045 |
| 0.538639999999986 | -0.044 |
| 0.539649999999986 | -0.043 |
| 0.540659999999986 | -0.042 |
| 0.541669999999986 | -0.041 |
| 0.542679999999986 | -0.04 |
| 0.543689999999986 | -0.039 |
| 0.544699999999986 | -0.038 |
| 0.545709999999986 | -0.037 |
| 0.546719999999986 | -0.037 |
| 0.547729999999986 | -0.036 |
| 0.548739999999986 | -0.035 |
| 0.549749999999986 | -0.034 |
| 0.550759999999986 | -0.033 |
| 0.551769999999986 | -0.032 |
| 0.552779999999986 | -0.031 |
| 0.553789999999986 | -0.03 |
| 0.554799999999986 | -0.029 |
| 0.555809999999986 | -0.028 |
| 0.556819999999986 | -0.027 |
| 0.557829999999986 | -0.026 |
| 0.558839999999986 | -0.025 |
| 0.559849999999986 | -0.025 |
| 0.560859999999985 | -0.024 |
| 0.561869999999985 | -0.023 |
| 0.562879999999985 | -0.022 |
| 0.563889999999985 | -0.021 |
| 0.564899999999985 | -0.02 |
| 0.565909999999985 | -0.019 |
| 0.566919999999985 | -0.018 |
| 0.567929999999985 | -0.017 |
| 0.568939999999985 | -0.016 |
| 0.569949999999985 | -0.015 |
| 0.570959999999985 | -0.014 |
| 0.571969999999985 | -0.013 |
| 0.572979999999985 | -0.012 |
| 0.573989999999985 | -0.011 |
| 0.574999999999985 | -0.01 |
| 0.576009999999985 | -0.009 |
| 0.577019999999985 | -0.008 |
| 0.578029999999985 | -0.007 |
| 0.579039999999985 | -0.006 |
| 0.580049999999985 | -0.005 |
| 0.581059999999985 | -0.004 |
| 0.582069999999985 | -0.003 |
| 0.583079999999984 | -0.002 |
| 0.584089999999984 | -0.001 |
| 0.585099999999984 | 0 |
| 0.586109999999984 | 0.001 |
| 0.587119999999984 | 0.002 |
| 0.588129999999984 | 0.003 |
| 0.589139999999984 | 0.004 |
| 0.590149999999984 | 0.006 |
| 0.591159999999984 | 0.007 |
| 0.592169999999984 | 0.008 |
| 0.593179999999984 | 0.009 |
| 0.594189999999984 | 0.01 |
| 0.595199999999984 | 0.011 |
| 0.596209999999984 | 0.012 |
| 0.597219999999984 | 0.013 |
| 0.598229999999984 | 0.014 |
| 0.599239999999984 | 0.015 |
| 0.600249999999984 | 0.016 |
| 0.601259999999984 | 0.017 |
| 0.602269999999984 | 0.018 |
| 0.603279999999984 | 0.02 |
| 0.604289999999983 | 0.021 |
| 0.605299999999983 | 0.022 |
| 0.606309999999983 | 0.023 |
| 0.607319999999983 | 0.024 |
| 0.608329999999983 | 0.025 |
| 0.609339999999983 | 0.026 |
| 0.610349999999983 | 0.027 |
| 0.611359999999983 | 0.029 |
| 0.612369999999983 | 0.03 |
| 0.613379999999983 | 0.031 |
| 0.614389999999983 | 0.032 |
| 0.615399999999983 | 0.033 |
| 0.616409999999983 | 0.034 |
| 0.617419999999983 | 0.035 |
| 0.618429999999983 | 0.037 |
| 0.619439999999983 | 0.038 |
| 0.620449999999983 | 0.039 |
| 0.621459999999983 | 0.04 |
| 0.622469999999983 | 0.041 |
| 0.623479999999983 | 0.042 |
| 0.624489999999983 | 0.044 |
| 0.625499999999983 | 0.045 |
| 0.626509999999982 | 0.046 |
| 0.627519999999982 | 0.047 |
| 0.628529999999982 | 0.048 |
| 0.629539999999982 | 0.049 |
| 0.630549999999982 | 0.051 |
| 0.631559999999982 | 0.052 |
| 0.632569999999982 | 0.053 |
| 0.633579999999982 | 0.054 |
| 0.634589999999982 | 0.056 |
| 0.635599999999982 | 0.057 |
| 0.636609999999982 | 0.058 |
| 0.637619999999982 | 0.059 |
| 0.638629999999982 | 0.06 |
| 0.639639999999982 | 0.062 |
| 0.640649999999982 | 0.063 |
| 0.641659999999982 | 0.064 |
| 0.642669999999982 | 0.065 |
| 0.643679999999982 | 0.067 |
| 0.644689999999982 | 0.068 |
| 0.645699999999982 | 0.069 |
| 0.646709999999982 | 0.07 |
| 0.647719999999982 | 0.072 |
| 0.648729999999982 | 0.073 |
| 0.649739999999981 | 0.074 |
| 0.650749999999981 | 0.076 |
| 0.651759999999981 | 0.077 |
| 0.652769999999981 | 0.078 |
| 0.653779999999981 | 0.079 |
| 0.654789999999981 | 0.081 |
| 0.655799999999981 | 0.082 |
| 0.656809999999981 | 0.083 |
| 0.657819999999981 | 0.085 |
| 0.658829999999981 | 0.086 |
| 0.659839999999981 | 0.087 |
| 0.660849999999981 | 0.089 |
| 0.661859999999981 | 0.09 |
| 0.662869999999981 | 0.091 |
| 0.663879999999981 | 0.093 |
| 0.664889999999981 | 0.094 |
| 0.665899999999981 | 0.095 |
| 0.666909999999981 | 0.097 |
| 0.667919999999981 | 0.098 |
| 0.668929999999981 | 0.099 |
| 0.669939999999981 | 0.101 |
| 0.670949999999981 | 0.102 |
| 0.67195999999998 | 0.103 |
| 0.67296999999998 | 0.105 |
| 0.67397999999998 | 0.106 |
| 0.67498999999998 | 0.108 |
| 0.67599999999998 | 0.109 |
| 0.67700999999998 | 0.11 |
| 0.67801999999998 | 0.112 |
| 0.67902999999998 | 0.113 |
| 0.68003999999998 | 0.114 |
| 0.68104999999998 | 0.116 |
| 0.68205999999998 | 0.117 |
| 0.68306999999998 | 0.119 |
| 0.68407999999998 | 0.12 |
| 0.68508999999998 | 0.122 |
| 0.68609999999998 | 0.123 |
| 0.68710999999998 | 0.124 |
| 0.68811999999998 | 0.126 |
| 0.68912999999998 | 0.127 |
| 0.69013999999998 | 0.129 |
| 0.69114999999998 | 0.13 |
| 0.69215999999998 | 0.132 |
| 0.69316999999998 | 0.133 |
| 0.694179999999979 | 0.135 |
| 0.695189999999979 | 0.136 |
| 0.696199999999979 | 0.137 |
| 0.697209999999979 | 0.139 |
| 0.698219999999979 | 0.14 |
| 0.699229999999979 | 0.142 |
| 0.700239999999979 | 0.143 |
| 0.701249999999979 | 0.145 |
| 0.702259999999979 | 0.146 |
| 0.703269999999979 | 0.148 |
| 0.704279999999979 | 0.149 |
| 0.705289999999979 | 0.151 |
| 0.706299999999979 | 0.152 |
| 0.707309999999979 | 0.154 |
| 0.708319999999979 | 0.155 |
| 0.709329999999979 | 0.157 |
| 0.710339999999979 | 0.158 |
| 0.711349999999979 | 0.16 |
| 0.712359999999979 | 0.161 |
| 0.713369999999979 | 0.163 |
| 0.714379999999979 | 0.165 |
| 0.715389999999979 | 0.166 |
| 0.716399999999979 | 0.168 |
| 0.717409999999978 | 0.169 |
| 0.718419999999978 | 0.171 |
| 0.719429999999978 | 0.172 |
| 0.720439999999978 | 0.174 |
| 0.721449999999978 | 0.176 |
| 0.722459999999978 | 0.177 |
| 0.723469999999978 | 0.179 |
| 0.724479999999978 | 0.18 |
| 0.725489999999978 | 0.182 |
| 0.726499999999978 | 0.183 |
| 0.727509999999978 | 0.185 |
| 0.728519999999978 | 0.187 |
| 0.729529999999978 | 0.188 |
| 0.730539999999978 | 0.19 |
| 0.731549999999978 | 0.192 |
| 0.732559999999978 | 0.193 |
| 0.733569999999978 | 0.195 |
| 0.734579999999978 | 0.196 |
| 0.735589999999978 | 0.198 |
| 0.736599999999978 | 0.2 |
| 0.737609999999978 | 0.201 |
| 0.738619999999978 | 0.203 |
| 0.739629999999978 | 0.205 |
| 0.740639999999977 | 0.206 |
| 0.741649999999977 | 0.208 |
| 0.742659999999977 | 0.21 |
| 0.743669999999977 | 0.211 |
| 0.744679999999977 | 0.213 |
| 0.745689999999977 | 0.215 |
| 0.746699999999977 | 0.216 |
| 0.747709999999977 | 0.218 |
| 0.748719999999977 | 0.22 |
| 0.749729999999977 | 0.221 |
| 0.750739999999977 | 0.223 |
| 0.751749999999977 | 0.225 |
| 0.752759999999977 | 0.227 |
| 0.753769999999977 | 0.228 |
| 0.754779999999977 | 0.23 |
| 0.755789999999977 | 0.232 |
| 0.756799999999977 | 0.233 |
| 0.757809999999977 | 0.235 |
| 0.758819999999977 | 0.237 |
| 0.759829999999977 | 0.239 |
| 0.760839999999977 | 0.24 |
| 0.761849999999977 | 0.242 |
| 0.762859999999976 | 0.244 |
| 0.763869999999976 | 0.246 |
| 0.764879999999976 | 0.247 |
| 0.765889999999976 | 0.249 |
| 0.766899999999976 | 0.251 |
| 0.767909999999976 | 0.253 |
| 0.768919999999976 | 0.255 |
| 0.769929999999976 | 0.256 |
| 0.770939999999976 | 0.258 |
| 0.771949999999976 | 0.26 |
| 0.772959999999976 | 0.262 |
| 0.773969999999976 | 0.264 |
| 0.774979999999976 | 0.265 |
| 0.775989999999976 | 0.267 |
| 0.776999999999976 | 0.269 |
| 0.778009999999976 | 0.271 |
| 0.779019999999976 | 0.273 |
| 0.780029999999976 | 0.275 |
| 0.781039999999976 | 0.276 |
| 0.782049999999976 | 0.278 |
| 0.783059999999976 | 0.28 |
| 0.784069999999976 | 0.282 |
| 0.785079999999975 | 0.284 |
| 0.786089999999975 | 0.286 |
| 0.787099999999975 | 0.288 |
| 0.788109999999975 | 0.29 |
| 0.789119999999975 | 0.291 |
| 0.790129999999975 | 0.293 |
| 0.791139999999975 | 0.295 |
| 0.792149999999975 | 0.297 |
| 0.793159999999975 | 0.299 |
| 0.794169999999975 | 0.301 |
| 0.795179999999975 | 0.303 |
| 0.796189999999975 | 0.305 |
| 0.797199999999975 | 0.307 |
| 0.798209999999975 | 0.309 |
| 0.799219999999975 | 0.311 |
| 0.800229999999975 | 0.312 |
| 0.801239999999975 | 0.314 |
| 0.802249999999975 | 0.316 |
| 0.803259999999975 | 0.318 |
| 0.804269999999975 | 0.32 |
| 0.805279999999975 | 0.322 |
| 0.806289999999975 | 0.324 |
| 0.807299999999975 | 0.326 |
| 0.808309999999975 | 0.328 |
| 0.809319999999974 | 0.33 |
| 0.810329999999974 | 0.332 |
| 0.811339999999974 | 0.334 |
| 0.812349999999974 | 0.336 |
| 0.813359999999974 | 0.338 |
| 0.814369999999974 | 0.34 |
| 0.815379999999974 | 0.342 |
| 0.816389999999974 | 0.344 |
| 0.817399999999974 | 0.346 |
| 0.818409999999974 | 0.348 |
| 0.819419999999974 | 0.35 |
| 0.820429999999974 | 0.352 |
| 0.821439999999974 | 0.354 |
| 0.822449999999974 | 0.356 |
| 0.823459999999974 | 0.358 |
| 0.824469999999974 | 0.36 |
| 0.825479999999974 | 0.362 |
| 0.826489999999974 | 0.365 |
| 0.827499999999974 | 0.367 |
| 0.828509999999974 | 0.369 |
| 0.829519999999974 | 0.371 |
| 0.830529999999974 | 0.373 |
| 0.831539999999973 | 0.375 |
| 0.832549999999973 | 0.377 |
| 0.833559999999973 | 0.379 |
| 0.834569999999973 | 0.381 |
| 0.835579999999973 | 0.383 |
| 0.836589999999973 | 0.386 |
| 0.837599999999973 | 0.388 |
| 0.838609999999973 | 0.39 |
| 0.839619999999973 | 0.392 |
| 0.840629999999973 | 0.394 |
| 0.841639999999973 | 0.396 |
| 0.842649999999973 | 0.398 |
| 0.843659999999973 | 0.4 |
| 0.844669999999973 | 0.403 |
| 0.845679999999973 | 0.405 |
| 0.846689999999973 | 0.407 |
| 0.847699999999973 | 0.409 |
| 0.848709999999973 | 0.411 |
| 0.849719999999973 | 0.414 |
| 0.850729999999973 | 0.416 |
| 0.851739999999973 | 0.418 |
| 0.852749999999973 | 0.42 |
| 0.853759999999972 | 0.422 |
| 0.854769999999972 | 0.425 |
| 0.855779999999972 | 0.427 |
| 0.856789999999972 | 0.429 |
| 0.857799999999972 | 0.431 |
| 0.858809999999972 | 0.433 |
| 0.859819999999972 | 0.436 |
| 0.860829999999972 | 0.438 |
| 0.861839999999972 | 0.44 |
| 0.862849999999972 | 0.442 |
| 0.863859999999972 | 0.445 |
| 0.864869999999972 | 0.447 |
| 0.865879999999972 | 0.449 |
| 0.866889999999972 | 0.451 |
| 0.867899999999972 | 0.454 |
| 0.868909999999972 | 0.456 |
| 0.869919999999972 | 0.458 |
| 0.870929999999972 | 0.461 |
| 0.871939999999972 | 0.463 |
| 0.872949999999972 | 0.465 |
| 0.873959999999972 | 0.468 |
| 0.874969999999972 | 0.47 |
| 0.875979999999972 | 0.472 |
| 0.876989999999971 | 0.475 |
| 0.877999999999971 | 0.477 |
| 0.879009999999971 | 0.479 |
| 0.880019999999971 | 0.482 |
| 0.881029999999971 | 0.484 |
| 0.882039999999971 | 0.486 |
| 0.883049999999971 | 0.489 |
| 0.884059999999971 | 0.491 |
| 0.885069999999971 | 0.493 |
| 0.886079999999971 | 0.496 |
| 0.887089999999971 | 0.498 |
| 0.888099999999971 | 0.5 |
| 0.889109999999971 | 0.503 |
| 0.890119999999971 | 0.505 |
| 0.891129999999971 | 0.508 |
| 0.892139999999971 | 0.51 |
| 0.893149999999971 | 0.512 |
| 0.894159999999971 | 0.515 |
| 0.895169999999971 | 0.517 |
| 0.896179999999971 | 0.52 |
| 0.897189999999971 | 0.522 |
| 0.898199999999971 | 0.525 |
| 0.89920999999997 | 0.527 |
| 0.90021999999997 | 0.53 |
| 0.90122999999997 | 0.532 |
| 0.90223999999997 | 0.534 |
| 0.90324999999997 | 0.537 |
| 0.90425999999997 | 0.539 |
| 0.90526999999997 | 0.542 |
| 0.90627999999997 | 0.544 |
| 0.90728999999997 | 0.547 |
| 0.90829999999997 | 0.549 |
| 0.90930999999997 | 0.552 |
| 0.91031999999997 | 0.554 |
| 0.91132999999997 | 0.557 |
| 0.91233999999997 | 0.559 |
| 0.91334999999997 | 0.562 |
| 0.91435999999997 | 0.564 |
| 0.91536999999997 | 0.567 |
| 0.91637999999997 | 0.57 |
| 0.91738999999997 | 0.572 |
| 0.91839999999997 | 0.575 |
| 0.91940999999997 | 0.577 |
| 0.92041999999997 | 0.58 |
| 0.92142999999997 | 0.582 |
| 0.922439999999969 | 0.585 |
| 0.923449999999969 | 0.587 |
| 0.924459999999969 | 0.59 |
| 0.925469999999969 | 0.593 |
| 0.926479999999969 | 0.595 |
| 0.927489999999969 | 0.598 |
| 0.928499999999969 | 0.6 |
| 0.929509999999969 | 0.603 |
| 0.930519999999969 | 0.606 |
| 0.931529999999969 | 0.608 |
| 0.932539999999969 | 0.611 |
| 0.933549999999969 | 0.614 |
| 0.934559999999969 | 0.616 |
| 0.935569999999969 | 0.619 |
| 0.936579999999969 | 0.622 |
| 0.937589999999969 | 0.624 |
| 0.938599999999969 | 0.627 |
| 0.939609999999969 | 0.63 |
| 0.940619999999969 | 0.632 |
| 0.941629999999969 | 0.635 |
| 0.942639999999969 | 0.638 |
| 0.943649999999969 | 0.64 |
| 0.944659999999968 | 0.643 |
| 0.945669999999968 | 0.646 |
| 0.946679999999968 | 0.648 |
| 0.947689999999968 | 0.651 |
| 0.948699999999968 | 0.654 |
| 0.949709999999968 | 0.657 |
| 0.950719999999968 | 0.659 |
| 0.951729999999968 | 0.662 |
| 0.952739999999968 | 0.665 |
| 0.953749999999968 | 0.668 |
| 0.954759999999968 | 0.67 |
| 0.955769999999968 | 0.673 |
| 0.956779999999968 | 0.676 |
| 0.957789999999968 | 0.679 |
| 0.958799999999968 | 0.681 |
| 0.959809999999968 | 0.684 |
| 0.960819999999968 | 0.687 |
| 0.961829999999968 | 0.69 |
| 0.962839999999968 | 0.693 |
| 0.963849999999968 | 0.695 |
| 0.964859999999968 | 0.698 |
| 0.965869999999968 | 0.701 |
| 0.966879999999968 | 0.704 |
| 0.967889999999967 | 0.707 |
| 0.968899999999967 | 0.71 |
| 0.969909999999967 | 0.712 |
| 0.970919999999967 | 0.715 |
| 0.971929999999967 | 0.718 |
| 0.972939999999967 | 0.721 |
| 0.973949999999967 | 0.724 |
| 0.974959999999967 | 0.727 |
| 0.975969999999967 | 0.73 |
| 0.976979999999967 | 0.733 |
| 0.977989999999967 | 0.735 |
| 0.978999999999967 | 0.738 |
| 0.980009999999967 | 0.741 |
| 0.981019999999967 | 0.744 |
| 0.982029999999967 | 0.747 |
| 0.983039999999967 | 0.75 |
| 0.984049999999967 | 0.753 |
| 0.985059999999967 | 0.756 |
| 0.986069999999967 | 0.759 |
| 0.987079999999967 | 0.762 |
| 0.988089999999967 | 0.765 |
| 0.989099999999967 | 0.768 |
| 0.990109999999966 | 0.771 |
| 0.991119999999966 | 0.774 |
| 0.992129999999966 | 0.777 |
| 0.993139999999966 | 0.78 |
| 0.994149999999966 | 0.783 |
| 0.995159999999966 | 0.786 |
| 0.996169999999966 | 0.789 |
| 0.997179999999966 | 0.792 |
| 0.998189999999966 | 0.795 |
| 0.999199999999966 | 0.798 |
| 1.000209999999966 | 0.801 |
| 1.001219999999966 | 0.804 |
| 1.002229999999966 | 0.807 |
| 1.003239999999966 | 0.81 |
| 1.004249999999966 | 0.813 |
| 1.005259999999966 | 0.816 |
| 1.006269999999966 | 0.819 |
| 1.007279999999966 | 0.822 |
| 1.008289999999966 | 0.825 |
| 1.009299999999966 | 0.828 |
| 1.010309999999966 | 0.831 |
| 1.011319999999966 | 0.834 |
| 1.012329999999966 | 0.837 |
| 1.013339999999965 | 0.841 |
| 1.014349999999965 | 0.844 |
| 1.015359999999965 | 0.847 |
| 1.016369999999965 | 0.85 |
| 1.017379999999965 | 0.853 |
| 1.018389999999965 | 0.856 |
| 1.019399999999965 | 0.859 |
| 1.020409999999965 | 0.862 |
| 1.021419999999965 | 0.866 |
| 1.022429999999965 | 0.869 |
| 1.023439999999965 | 0.872 |
| 1.024449999999965 | 0.875 |
| 1.025459999999965 | 0.878 |
| 1.026469999999965 | 0.882 |
| 1.027479999999965 | 0.885 |
| 1.028489999999965 | 0.888 |
| 1.029499999999965 | 0.891 |
| 1.030509999999965 | 0.894 |
| 1.031519999999965 | 0.898 |
| 1.032529999999965 | 0.901 |
| 1.033539999999965 | 0.904 |
| 1.034549999999965 | 0.907 |
| 1.035559999999965 | 0.911 |
| 1.036569999999964 | 0.914 |
| 1.037579999999964 | 0.917 |
| 1.038589999999964 | 0.92 |
| 1.039599999999964 | 0.924 |
| 1.040609999999964 | 0.927 |
| 1.041619999999964 | 0.93 |
| 1.042629999999964 | 0.933 |
| 1.043639999999964 | 0.937 |
| 1.044649999999964 | 0.94 |
| 1.045659999999964 | 0.943 |
| 1.046669999999964 | 0.947 |
| 1.047679999999964 | 0.95 |
| 1.048689999999964 | 0.953 |
| 1.049699999999964 | 0.957 |
| 1.050709999999964 | 0.96 |
| 1.051719999999964 | 0.963 |
| 1.052729999999964 | 0.967 |
| 1.053739999999964 | 0.97 |
| 1.054749999999964 | 0.973 |
| 1.055759999999964 | 0.977 |
| 1.056769999999964 | 0.98 |
| 1.057779999999964 | 0.984 |
| 1.058789999999963 | 0.987 |
| 1.059799999999963 | 0.99 |
| 1.060809999999963 | 0.994 |
| 1.061819999999963 | 0.997 |
| 1.062829999999963 | 1.001 |
| 1.063839999999963 | 1.004 |
| 1.064849999999963 | 1.007 |
| 1.065859999999963 | 1.011 |
| 1.066869999999963 | 1.014 |
| 1.067879999999963 | 1.018 |
| 1.068889999999963 | 1.021 |
| 1.069899999999963 | 1.025 |
| 1.070909999999963 | 1.028 |
| 1.071919999999963 | 1.032 |
| 1.072929999999963 | 1.035 |
| 1.073939999999963 | 1.039 |
| 1.074949999999963 | 1.042 |
| 1.075959999999963 | 1.046 |
| 1.076969999999963 | 1.049 |
| 1.077979999999963 | 1.053 |
| 1.078989999999963 | 1.056 |
| 1.079999999999963 | 1.06 |